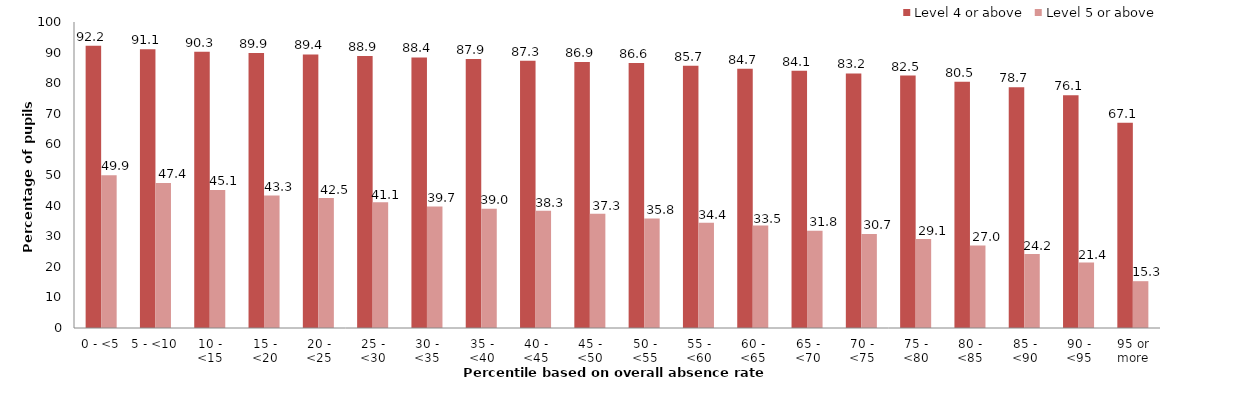
| Category | Level 4 or above | Level 5 or above |
|---|---|---|
| 0 - <5 | 92.2 | 49.9 |
| 5 - <10 | 91.1 | 47.4 |
| 10 - <15 | 90.3 | 45.1 |
| 15 - <20 | 89.9 | 43.3 |
| 20 - <25 | 89.4 | 42.5 |
| 25 - <30 | 88.9 | 41.1 |
| 30 - <35 | 88.4 | 39.7 |
| 35 - <40 | 87.9 | 39 |
| 40 - <45 | 87.3 | 38.3 |
| 45 - <50 | 86.9 | 37.3 |
| 50 - <55 | 86.6 | 35.8 |
| 55 - <60 | 85.7 | 34.4 |
| 60 - <65 | 84.7 | 33.5 |
| 65 - <70 | 84.1 | 31.8 |
| 70 - <75 | 83.2 | 30.7 |
| 75 - <80 | 82.5 | 29.1 |
| 80 - <85 | 80.5 | 27 |
| 85 - <90 | 78.7 | 24.2 |
| 90 - <95 | 76.1 | 21.4 |
| 95 or more | 67.1 | 15.3 |